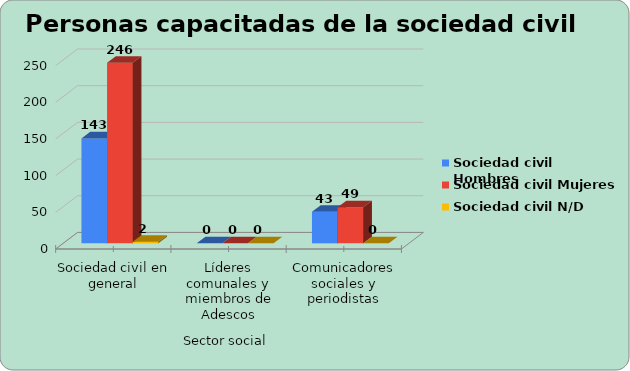
| Category | Sociedad civil |
|---|---|
| Sociedad civil en general | 2 |
| Líderes comunales y miembros de Adescos | 0 |
| Comunicadores sociales y periodistas | 0 |